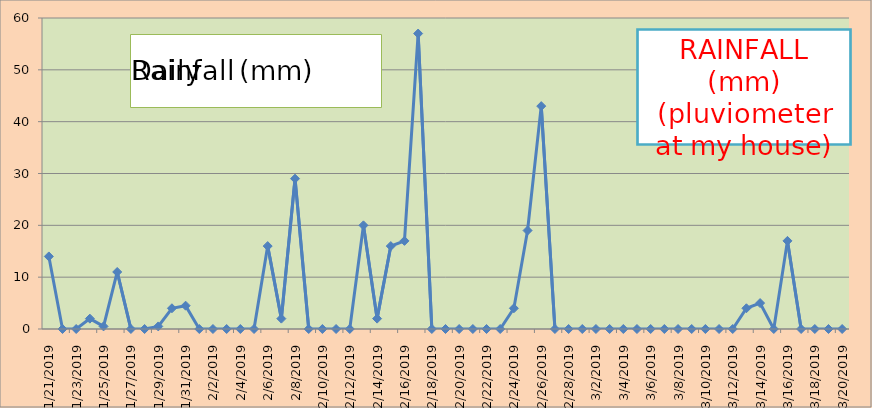
| Category | Series 0 |
|---|---|
| 2019-01-21 | 14 |
| 2019-01-22 | 0 |
| 2019-01-23 | 0 |
| 2019-01-24 | 2 |
| 2019-01-25 | 0.5 |
| 2019-01-26 | 11 |
| 2019-01-27 | 0 |
| 2019-01-28 | 0 |
| 2019-01-29 | 0.5 |
| 2019-01-30 | 4 |
| 2019-01-31 | 4.5 |
| 2019-02-01 | 0 |
| 2019-02-02 | 0 |
| 2019-02-03 | 0 |
| 2019-02-04 | 0 |
| 2019-02-05 | 0 |
| 2019-02-06 | 16 |
| 2019-02-07 | 2 |
| 2019-02-08 | 29 |
| 2019-02-09 | 0 |
| 2019-02-10 | 0 |
| 2019-02-11 | 0 |
| 2019-02-12 | 0 |
| 2019-02-13 | 20 |
| 2019-02-14 | 2 |
| 2019-02-15 | 16 |
| 2019-02-16 | 17 |
| 2019-02-17 | 57 |
| 2019-02-18 | 0 |
| 2019-02-19 | 0 |
| 2019-02-20 | 0 |
| 2019-02-21 | 0 |
| 2019-02-22 | 0 |
| 2019-02-23 | 0 |
| 2019-02-24 | 4 |
| 2019-02-25 | 19 |
| 2019-02-26 | 43 |
| 2019-02-27 | 0 |
| 2019-02-28 | 0 |
| 2019-03-01 | 0 |
| 2019-03-02 | 0 |
| 2019-03-03 | 0 |
| 2019-03-04 | 0 |
| 2019-03-05 | 0 |
| 2019-03-06 | 0 |
| 2019-03-07 | 0 |
| 2019-03-08 | 0 |
| 2019-03-09 | 0 |
| 2019-03-10 | 0 |
| 2019-03-11 | 0 |
| 2019-03-12 | 0 |
| 2019-03-13 | 4 |
| 2019-03-14 | 5 |
| 2019-03-15 | 0 |
| 2019-03-16 | 17 |
| 2019-03-17 | 0 |
| 2019-03-18 | 0 |
| 2019-03-19 | 0 |
| 2019-03-20 | 0 |